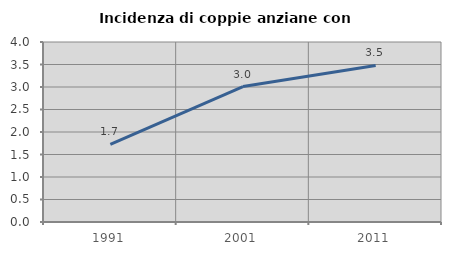
| Category | Incidenza di coppie anziane con figli |
|---|---|
| 1991.0 | 1.728 |
| 2001.0 | 3.009 |
| 2011.0 | 3.479 |